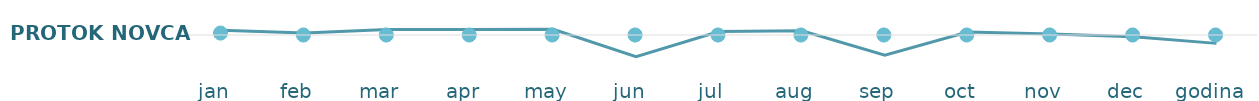
| Category | Protok novca |
|---|---|
| jan  | 169 |
| feb  | 69 |
| mar  | 192 |
| apr  | 199 |
| may  | 204 |
| jun  | -771 |
| jul  | 124 |
| aug  | 154 |
| sep  | -721 |
| oct  | 109 |
| nov  | 34 |
| dec  | -61 |
| godina   | -299 |